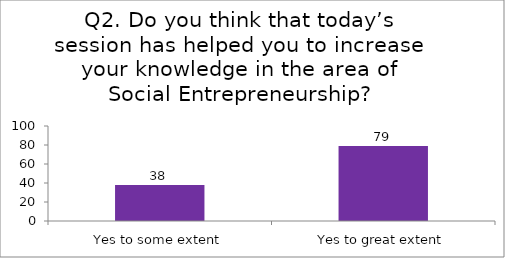
| Category | Q2. Do you think that today’s session has helped you to increase your knowledge in the area of Social Entrepreneurship? |
|---|---|
| Yes to some extent | 38 |
| Yes to great extent | 79 |